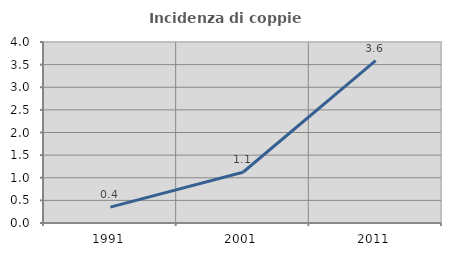
| Category | Incidenza di coppie miste |
|---|---|
| 1991.0 | 0.352 |
| 2001.0 | 1.122 |
| 2011.0 | 3.588 |